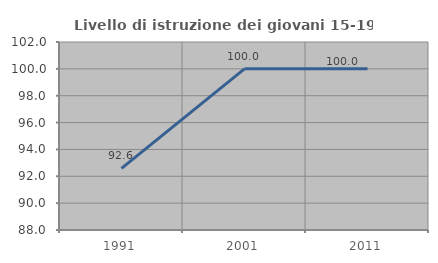
| Category | Livello di istruzione dei giovani 15-19 anni |
|---|---|
| 1991.0 | 92.593 |
| 2001.0 | 100 |
| 2011.0 | 100 |